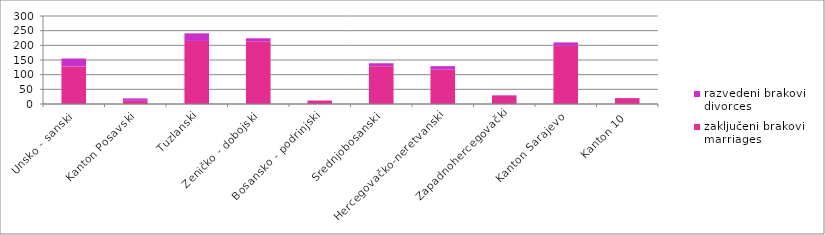
| Category | zaključeni brakovi
marriages | razvedeni brakovi
divorces |
|---|---|---|
| Unsko - sanski | 128 | 27 |
| Kanton Posavski | 11 | 8 |
| Tuzlanski | 215 | 26 |
| Zeničko - dobojski | 214 | 10 |
| Bosansko - podrinjski | 12 | 0 |
| Srednjobosanski | 129 | 10 |
| Hercegovačko-neretvanski | 117 | 12 |
| Zapadnohercegovački | 28 | 2 |
| Kanton Sarajevo | 199 | 11 |
| Kanton 10 | 20 | 0 |